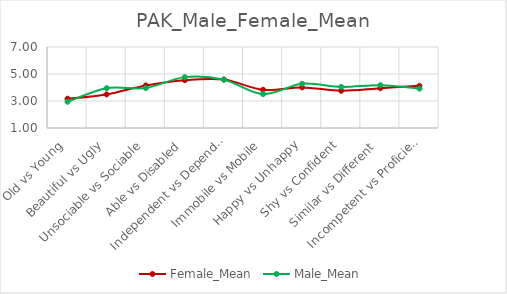
| Category | Female_Mean | Male_Mean |
|---|---|---|
| Old vs Young | 3.172 | 2.944 |
|  Beautiful vs Ugly | 3.489 | 3.95 |
| Unsociable vs Sociable | 4.154 | 3.959 |
| Able vs Disabled | 4.542 | 4.769 |
| Independent vs Dependent | 4.59 | 4.581 |
| Immobile vs Mobile | 3.833 | 3.512 |
| Happy vs Unhappy | 4.009 | 4.278 |
| Shy vs Confident | 3.762 | 4.047 |
| Similar vs Different | 3.947 | 4.169 |
| Incompetent vs Proficient | 4.123 | 3.916 |